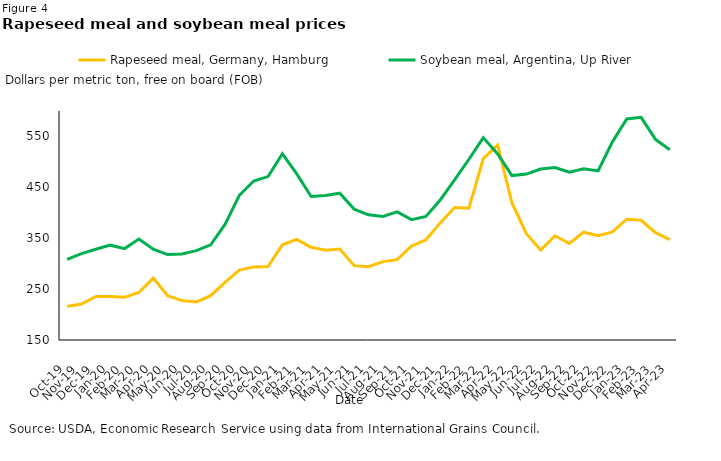
| Category | Rapeseed meal, Germany, Hamburg | Soybean meal, Argentina, Up River |
|---|---|---|
| 2019-10-01 | 216.039 | 308.565 |
| 2019-11-01 | 220.559 | 319.619 |
| 2019-12-01 | 235.58 | 328.273 |
| 2020-01-01 | 235.523 | 336.348 |
| 2020-02-01 | 233.824 | 329.6 |
| 2020-03-01 | 243.417 | 348.455 |
| 2020-04-01 | 271.698 | 328.273 |
| 2020-05-01 | 237.254 | 317.905 |
| 2020-06-01 | 227.501 | 319.091 |
| 2020-07-01 | 224.623 | 325.609 |
| 2020-08-01 | 237.223 | 337.143 |
| 2020-09-01 | 263.425 | 377.045 |
| 2020-10-01 | 287.288 | 434.409 |
| 2020-11-01 | 293.578 | 462.524 |
| 2020-12-01 | 294.219 | 471.13 |
| 2021-01-01 | 337.164 | 515.952 |
| 2021-02-01 | 347.612 | 476.4 |
| 2021-03-01 | 332.313 | 432.043 |
| 2021-04-01 | 326.589 | 433.773 |
| 2021-05-01 | 328.798 | 438.524 |
| 2021-06-01 | 296.153 | 406.909 |
| 2021-07-01 | 294.102 | 396.045 |
| 2021-08-01 | 304.031 | 392.636 |
| 2021-09-01 | 307.945 | 401.727 |
| 2021-10-01 | 334.675 | 386.524 |
| 2021-11-01 | 346.904 | 392.864 |
| 2021-12-01 | 380.136 | 425.174 |
| 2022-01-01 | 410.424 | 464.619 |
| 2022-02-01 | 409.06 | 505.15 |
| 2022-03-01 | 506.527 | 547.696 |
| 2022-04-01 | 533.002 | 515.714 |
| 2022-05-01 | 419.206 | 473.045 |
| 2022-06-01 | 358.826 | 476 |
| 2022-07-01 | 326.78 | 486.095 |
| 2022-08-01 | 354.787 | 488.957 |
| 2022-09-01 | 339.696 | 479.818 |
| 2022-10-01 | 361.859 | 486.6 |
| 2022-11-01 | 355.168 | 482.364 |
| 2022-12-01 | 362.319 | 539.409 |
| 2023-01-01 | 387.347 | 584.409 |
| 2023-02-01 | 385.268 | 587.55 |
| 2023-03-01 | 360.898 | 544.174 |
| 2023-04-01 | 347.34 | 524 |